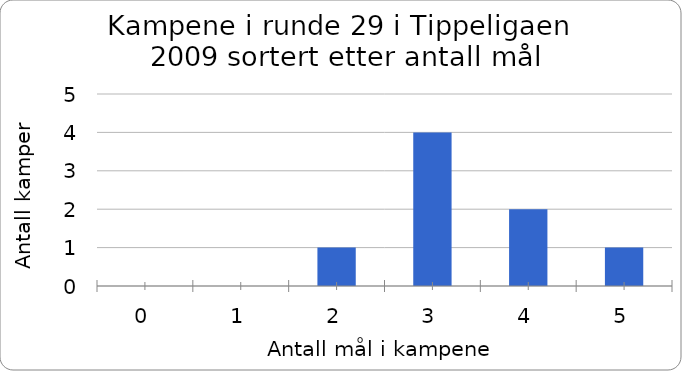
| Category | Antall kamper |
|---|---|
| 0.0 | 0 |
| 1.0 | 0 |
| 2.0 | 1 |
| 3.0 | 4 |
| 4.0 | 2 |
| 5.0 | 1 |